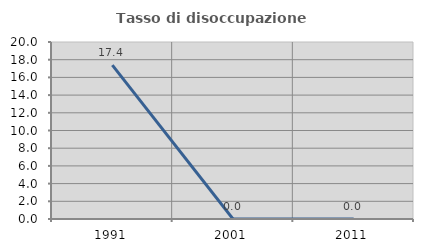
| Category | Tasso di disoccupazione giovanile  |
|---|---|
| 1991.0 | 17.391 |
| 2001.0 | 0 |
| 2011.0 | 0 |